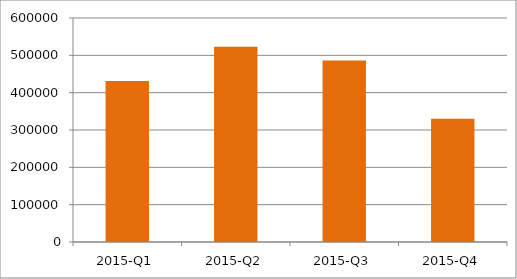
| Category | Total |
|---|---|
| 2015-Q1 | 431339 |
| 2015-Q2 | 523264 |
| 2015-Q3 | 485838 |
| 2015-Q4 | 330235 |